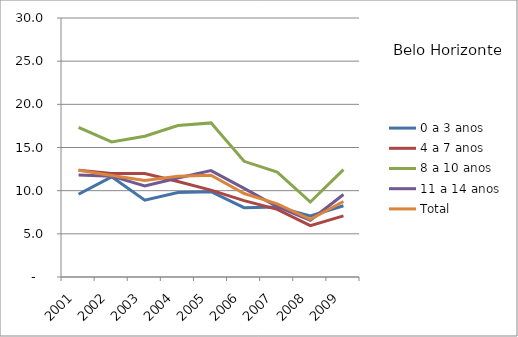
| Category | 0 a 3 anos | 4 a 7 anos | 8 a 10 anos | 11 a 14 anos | Total |
|---|---|---|---|---|---|
| 2001.0 | 9.59 | 12.38 | 17.32 | 11.81 | 12.36 |
| 2002.0 | 11.6 | 11.98 | 15.64 | 11.68 | 11.75 |
| 2003.0 | 8.89 | 11.98 | 16.3 | 10.55 | 11.17 |
| 2004.0 | 9.79 | 11.07 | 17.55 | 11.47 | 11.68 |
| 2005.0 | 9.88 | 10.06 | 17.85 | 12.32 | 11.79 |
| 2006.0 | 8.03 | 8.84 | 13.4 | 10.26 | 9.67 |
| 2007.0 | 8.11 | 7.83 | 12.16 | 8.16 | 8.47 |
| 2008.0 | 7.06 | 5.95 | 8.68 | 6.58 | 6.69 |
| 2009.0 | 8.25 | 7.08 | 12.44 | 9.56 | 8.75 |